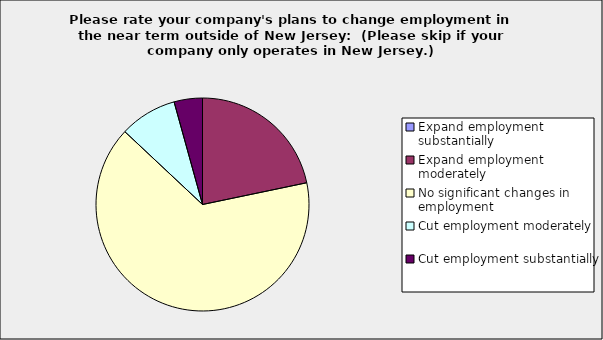
| Category | Series 0 |
|---|---|
| Expand employment substantially | 0 |
| Expand employment moderately | 0.217 |
| No significant changes in employment | 0.652 |
| Cut employment moderately | 0.087 |
| Cut employment substantially | 0.043 |